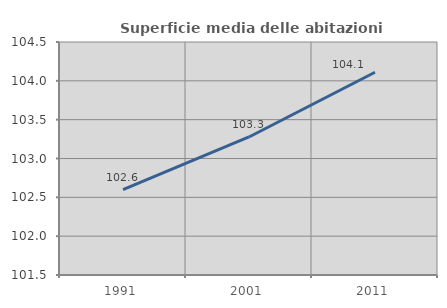
| Category | Superficie media delle abitazioni occupate |
|---|---|
| 1991.0 | 102.598 |
| 2001.0 | 103.277 |
| 2011.0 | 104.111 |